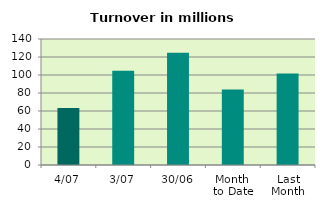
| Category | Series 0 |
|---|---|
| 4/07 | 63.205 |
| 3/07 | 104.61 |
| 30/06 | 124.686 |
| Month 
to Date | 83.908 |
| Last
Month | 101.544 |